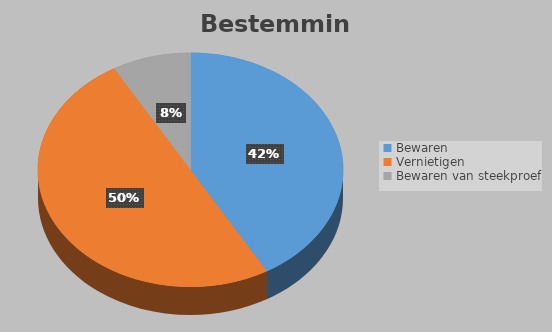
| Category | Series 0 |
|---|---|
| Bewaren | 0.417 |
| Vernietigen | 0.5 |
| Bewaren van steekproef | 0.083 |